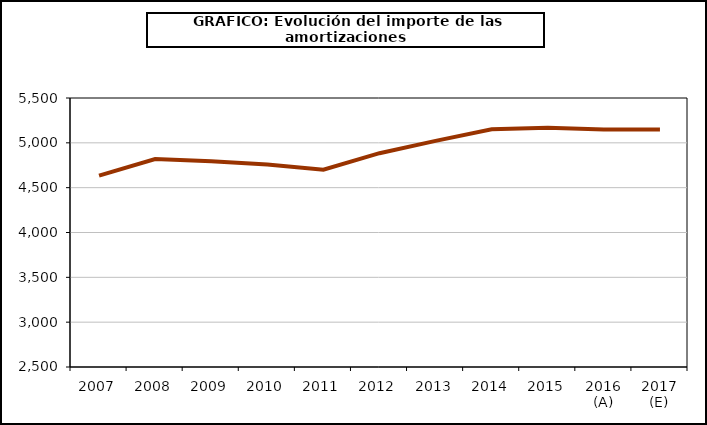
| Category | amortizacion |
|---|---|
| 2007 | 4634.4 |
| 2008 | 4820.083 |
| 2009 | 4794.062 |
| 2010 | 4758.255 |
| 2011 | 4699.859 |
| 2012 | 4884.543 |
| 2013 | 5021.523 |
| 2014 | 5151.042 |
| 2015 | 5167.348 |
| 2016 (A) | 5149.448 |
| 2017 (E) | 5148.978 |